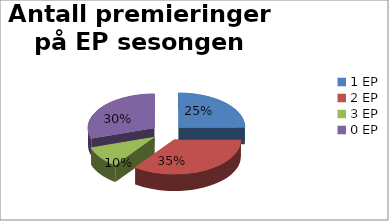
| Category | Antall premieringer på EP sesongen 12/13 |
|---|---|
| 1 EP | 5 |
| 2 EP | 7 |
| 3 EP | 2 |
| 0 EP | 6 |